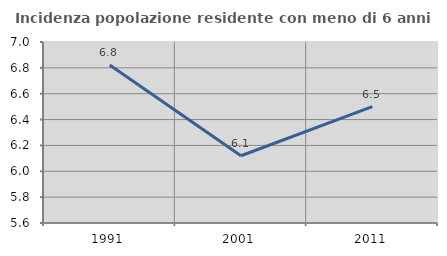
| Category | Incidenza popolazione residente con meno di 6 anni |
|---|---|
| 1991.0 | 6.822 |
| 2001.0 | 6.12 |
| 2011.0 | 6.5 |